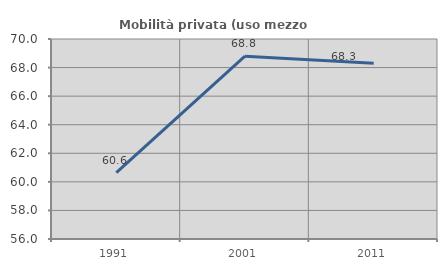
| Category | Mobilità privata (uso mezzo privato) |
|---|---|
| 1991.0 | 60.645 |
| 2001.0 | 68.8 |
| 2011.0 | 68.311 |